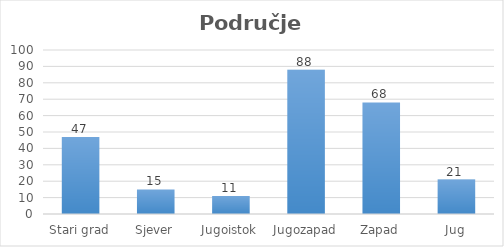
| Category | Područje grada |
|---|---|
| Stari grad | 47 |
| Sjever | 15 |
| Jugoistok | 11 |
| Jugozapad | 88 |
| Zapad | 68 |
| Jug | 21 |